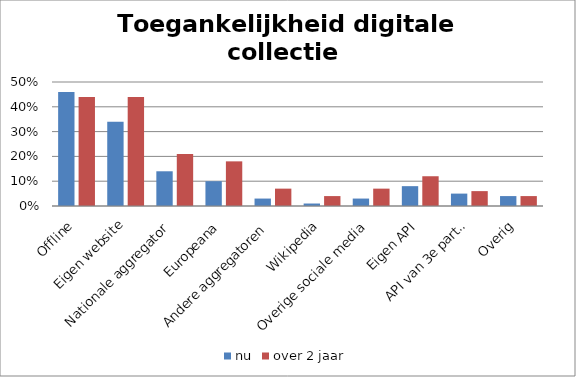
| Category | nu | over 2 jaar |
|---|---|---|
| Offline | 0.46 | 0.44 |
| Eigen website | 0.34 | 0.44 |
| Nationale aggregator | 0.14 | 0.21 |
| Europeana | 0.1 | 0.18 |
| Andere aggregatoren | 0.03 | 0.07 |
| Wikipedia | 0.01 | 0.04 |
| Overige sociale media | 0.03 | 0.07 |
| Eigen API | 0.08 | 0.12 |
| API van 3e partij | 0.05 | 0.06 |
| Overig | 0.04 | 0.04 |